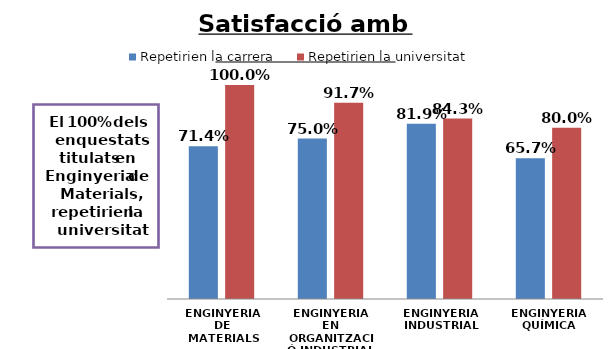
| Category | Repetirien la carrera | Repetirien la universitat |
|---|---|---|
| ENGINYERIA DE MATERIALS | 0.714 | 1 |
| ENGINYERIA EN ORGANITZACIÓ INDUSTRIAL | 0.75 | 0.917 |
| ENGINYERIA INDUSTRIAL | 0.819 | 0.843 |
| ENGINYERIA QUÍMICA | 0.657 | 0.8 |